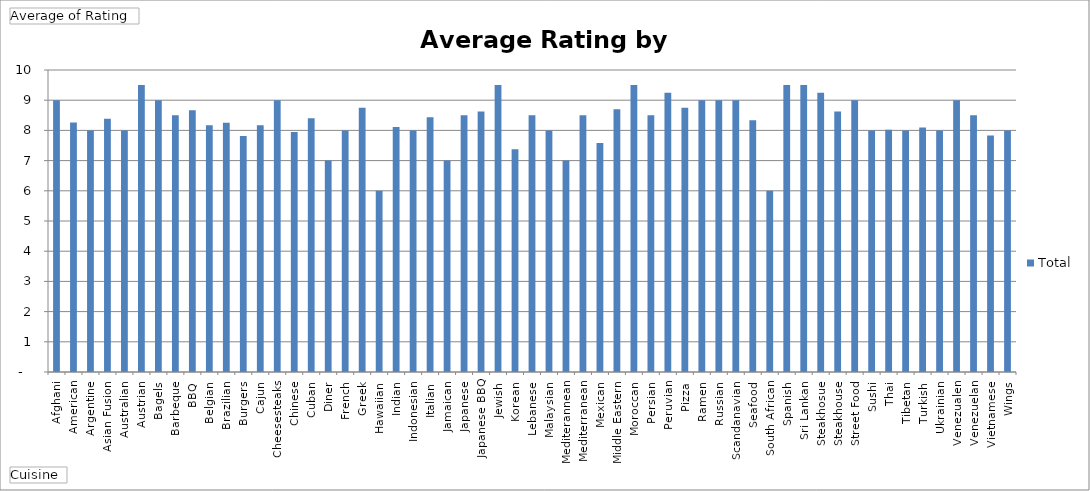
| Category | Total |
|---|---|
| Afghani | 9 |
| American | 8.26 |
| Argentine | 8 |
| Asian Fusion | 8.385 |
| Australian | 8 |
| Austrian | 9.5 |
| Bagels | 9 |
| Barbeque | 8.5 |
| BBQ | 8.667 |
| Belgian | 8.167 |
| Brazilian | 8.25 |
| Burgers | 7.812 |
| Cajun | 8.167 |
| Cheesesteaks | 9 |
| Chinese | 7.944 |
| Cuban | 8.4 |
| Diner | 7 |
| French | 8 |
| Greek | 8.75 |
| Hawaiian | 6 |
| Indian | 8.115 |
| Indonesian | 8 |
| Italian | 8.438 |
| Jamaican | 7 |
| Japanese | 8.5 |
| Japanese BBQ | 8.625 |
| Jewish | 9.5 |
| Korean | 7.375 |
| Lebanese | 8.5 |
| Malaysian | 8 |
| Mediterannean | 7 |
| Mediterranean | 8.5 |
| Mexican | 7.583 |
| Middle Eastern | 8.7 |
| Moroccan | 9.5 |
| Persian | 8.5 |
| Peruvian | 9.25 |
| Pizza | 8.75 |
| Ramen | 9 |
| Russian | 9 |
| Scandanavian | 9 |
| Seafood | 8.333 |
| South African | 6 |
| Spanish | 9.5 |
| Sri Lankan | 9.5 |
| Steakhosue | 9.25 |
| Steakhouse | 8.625 |
| Street Food | 9 |
| Sushi | 8 |
| Thai | 8.019 |
| Tibetan | 8 |
| Turkish | 8.1 |
| Ukrainian | 8 |
| Venezualen | 9 |
| Venezuelan | 8.5 |
| Vietnamese | 7.833 |
| Wings | 8 |